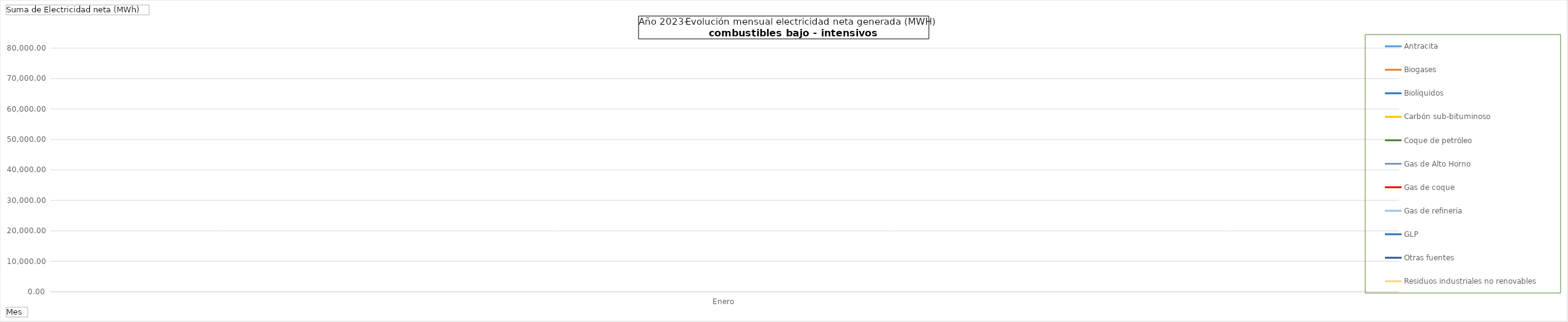
| Category | Antracita | Biogases | Biolíquidos | Carbón sub-bituminoso | Coque de petróleo | Gas de Alto Horno | Gas de coque | Gas de refinería | GLP | Otras fuentes | Residuos industriales no renovables |
|---|---|---|---|---|---|---|---|---|---|---|---|
| Enero | 0 | 47632.3 | 0 | 0 | 0 | 74745.43 | 720.6 | 33458.85 | 0 | 11799.42 | 6631.76 |